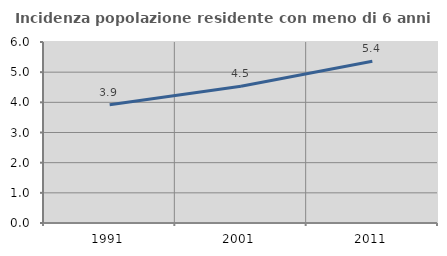
| Category | Incidenza popolazione residente con meno di 6 anni |
|---|---|
| 1991.0 | 3.92 |
| 2001.0 | 4.534 |
| 2011.0 | 5.36 |